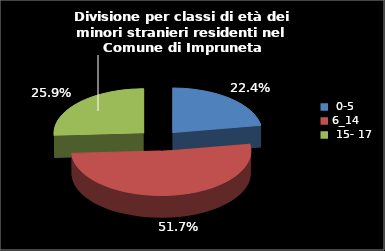
| Category | Series 0 |
|---|---|
| 0-5 | 32 |
| 6_14 | 74 |
| 15- 17 | 37 |